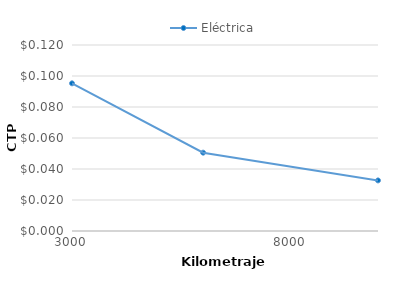
| Category | Eléctrica |
|---|---|
| 3000.0 | 0.095 |
| 6000.0 | 0.051 |
| 10000.0 | 0.033 |